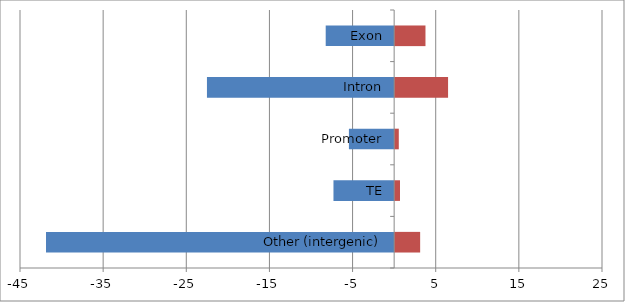
| Category | Series 0 | Series 1 |
|---|---|---|
| Other (intergenic) | -41.872 | 3.128 |
| TE | -7.298 | 0.702 |
| Promoter | -5.44 | 0.56 |
| Intron | -22.514 | 6.486 |
| Exon | -8.231 | 3.769 |